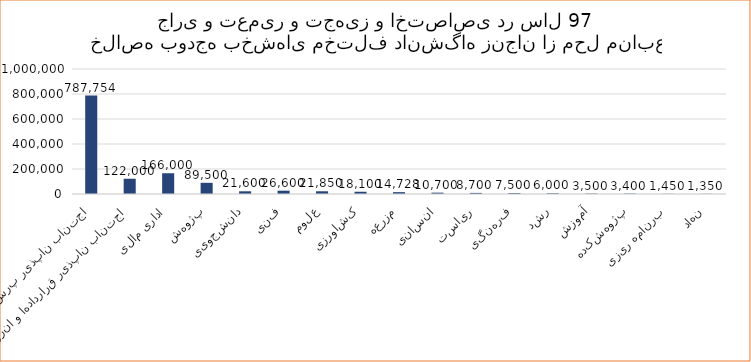
| Category | جمع |
|---|---|
| اجتناب ناپذیر پرسنلی | 787754 |
| اجتناب ناپذیر قراردادها و انرژی | 122000 |
| اداری مالی | 166000 |
| پژوهش | 89500 |
| دانشجویی | 21600 |
| فنی | 26600 |
| علوم | 21850 |
| کشاورزی | 18100 |
| مزرعه | 14728 |
| انسانی | 10700 |
| ریاست | 8700 |
| فرهنگی | 7500 |
| رشد | 6000 |
| آموزش | 3500 |
| پژوهشکده | 3400 |
| برنامه ریزی | 1450 |
| نهاد | 1350 |